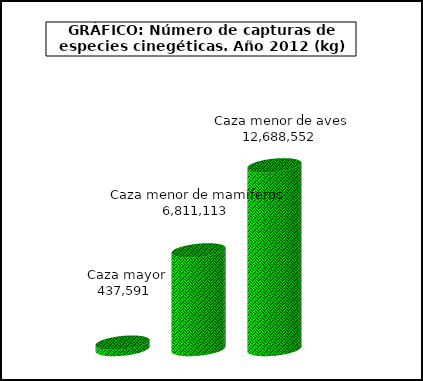
| Category | Cazar |
|---|---|
| Caza mayor | 437591 |
| Caza menor de mamíferos | 6811113 |
| Caza menor de aves | 12688552 |